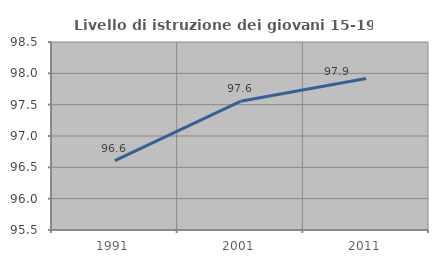
| Category | Livello di istruzione dei giovani 15-19 anni |
|---|---|
| 1991.0 | 96.606 |
| 2001.0 | 97.553 |
| 2011.0 | 97.918 |